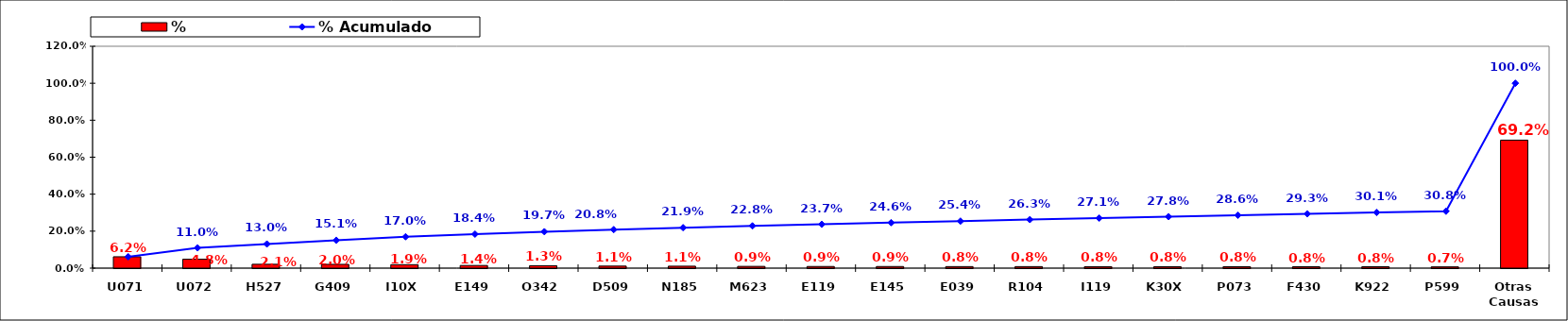
| Category | % |
|---|---|
| U071 | 0.062 |
| U072 | 0.048 |
| H527 | 0.021 |
| G409 | 0.02 |
| I10X | 0.019 |
| E149 | 0.014 |
| O342 | 0.013 |
| D509 | 0.011 |
| N185 | 0.011 |
| M623 | 0.009 |
| E119 | 0.009 |
| E145 | 0.009 |
| E039 | 0.008 |
| R104 | 0.008 |
| I119 | 0.008 |
| K30X | 0.008 |
| P073 | 0.008 |
| F430 | 0.008 |
| K922 | 0.008 |
| P599 | 0.007 |
| Otras Causas | 0.692 |